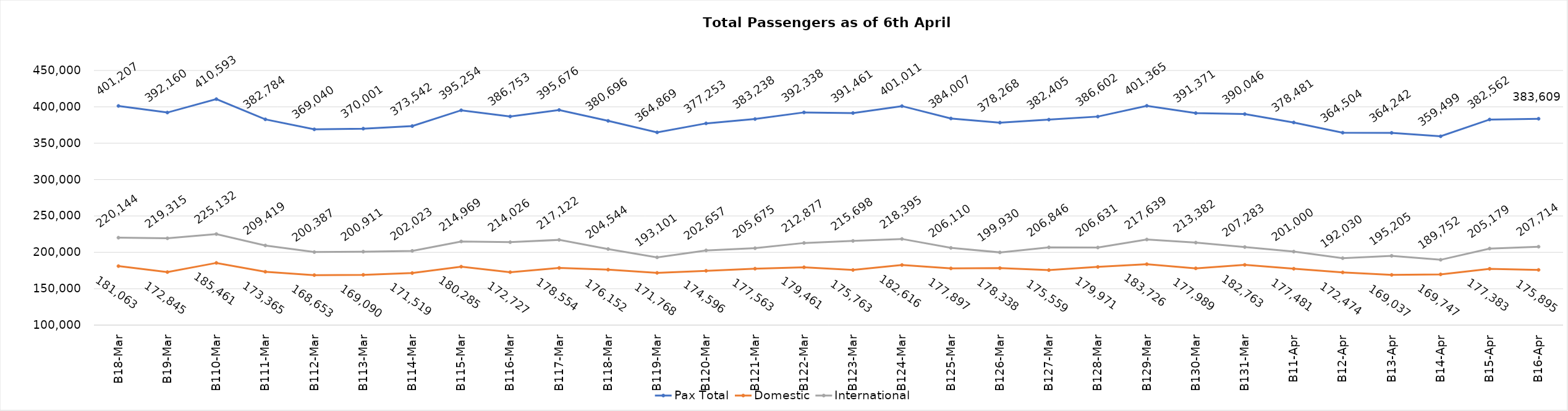
| Category | Pax Total | Domestic | International |
|---|---|---|---|
| 2024-03-08 | 401207 | 181063 | 220144 |
| 2024-03-09 | 392160 | 172845 | 219315 |
| 2024-03-10 | 410593 | 185461 | 225132 |
| 2024-03-11 | 382784 | 173365 | 209419 |
| 2024-03-12 | 369040 | 168653 | 200387 |
| 2024-03-13 | 370001 | 169090 | 200911 |
| 2024-03-14 | 373542 | 171519 | 202023 |
| 2024-03-15 | 395254 | 180285 | 214969 |
| 2024-03-16 | 386753 | 172727 | 214026 |
| 2024-03-17 | 395676 | 178554 | 217122 |
| 2024-03-18 | 380696 | 176152 | 204544 |
| 2024-03-19 | 364869 | 171768 | 193101 |
| 2024-03-20 | 377253 | 174596 | 202657 |
| 2024-03-21 | 383238 | 177563 | 205675 |
| 2024-03-22 | 392338 | 179461 | 212877 |
| 2024-03-23 | 391461 | 175763 | 215698 |
| 2024-03-24 | 401011 | 182616 | 218395 |
| 2024-03-25 | 384007 | 177897 | 206110 |
| 2024-03-26 | 378268 | 178338 | 199930 |
| 2024-03-27 | 382405 | 175559 | 206846 |
| 2024-03-28 | 386602 | 179971 | 206631 |
| 2024-03-29 | 401365 | 183726 | 217639 |
| 2024-03-30 | 391371 | 177989 | 213382 |
| 2024-03-31 | 390046 | 182763 | 207283 |
| 2024-04-01 | 378481 | 177481 | 201000 |
| 2024-04-02 | 364504 | 172474 | 192030 |
| 2024-04-03 | 364242 | 169037 | 195205 |
| 2024-04-04 | 359499 | 169747 | 189752 |
| 2024-04-05 | 382562 | 177383 | 205179 |
| 2024-04-06 | 383609 | 175895 | 207714 |